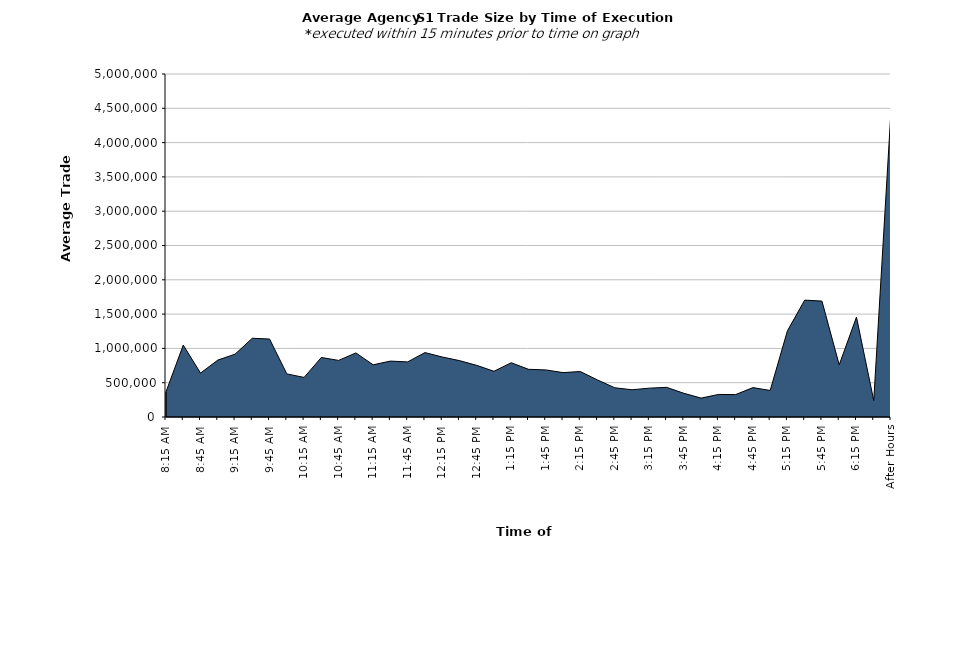
| Category | Series 0 |
|---|---|
| 8:15 AM | 367423.454 |
| 8:30 AM | 1047886.876 |
| 8:45 AM | 640012.272 |
| 9:00 AM | 829366.64 |
| 9:15 AM | 915594.835 |
| 9:30 AM | 1147765.119 |
| 9:45 AM | 1136419.531 |
| 10:00 AM | 628391.692 |
| 10:15 AM | 576991.38 |
| 10:30 AM | 867954.411 |
| 10:45 AM | 825007.545 |
| 11:00 AM | 934093.761 |
| 11:15 AM | 760922.946 |
| 11:30 AM | 814762.167 |
| 11:45 AM | 803336.539 |
| 12:00 PM | 938878.422 |
| 12:15 PM | 874932.084 |
| 12:30 PM | 821921.488 |
| 12:45 PM | 752713.84 |
| 1:00 PM | 666597.98 |
| 1:15 PM | 790647.423 |
| 1:30 PM | 695161.06 |
| 1:45 PM | 686436.458 |
| 2:00 PM | 647272.317 |
| 2:15 PM | 662866.792 |
| 2:30 PM | 539562.628 |
| 2:45 PM | 425837.3 |
| 3:00 PM | 397005.115 |
| 3:15 PM | 420686.109 |
| 3:30 PM | 432442.913 |
| 3:45 PM | 345529.865 |
| 4:00 PM | 275214.017 |
| 4:15 PM | 328849.163 |
| 4:30 PM | 326738.86 |
| 4:45 PM | 428643.967 |
| 5:00 PM | 386853.936 |
| 5:15 PM | 1255958.829 |
| 5:30 PM | 1703795.608 |
| 5:45 PM | 1689229.493 |
| 6:00 PM | 760948.484 |
| 6:15 PM | 1456360.148 |
| 6:30 PM | 240320.388 |
| After Hours | 4468072.508 |